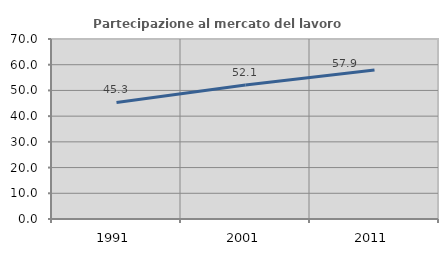
| Category | Partecipazione al mercato del lavoro  femminile |
|---|---|
| 1991.0 | 45.349 |
| 2001.0 | 52.126 |
| 2011.0 | 57.904 |